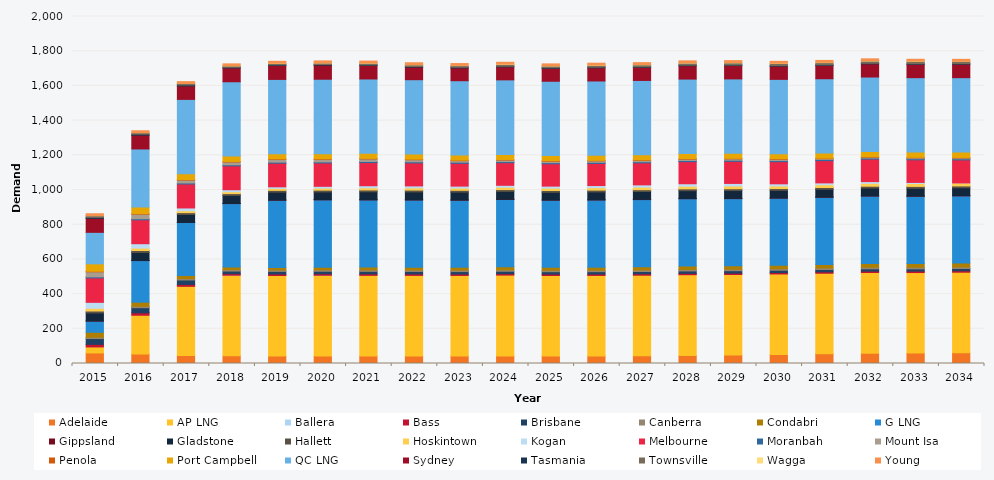
| Category | Adelaide | AP LNG | Ballera | Bass | Brisbane | Canberra | Condabri | G LNG | Gippsland | Gladstone | Hallett | Hoskintown | Kogan | Melbourne | Moranbah | Mount Isa | Penola | Port Campbell | QC LNG | Sydney | Tasmania | Townsville | Wagga | Young |
|---|---|---|---|---|---|---|---|---|---|---|---|---|---|---|---|---|---|---|---|---|---|---|---|---|
| 2015.0 | 60.871 | 34.57 | 0 | 14.805 | 33.591 | 7.631 | 28.355 | 64.65 | 0.695 | 46.165 | 11.235 | 15.606 | 34.311 | 140.697 | 6.137 | 28.959 | 3.208 | 42.857 | 181.643 | 80.61 | 5.536 | 10.002 | 0.051 | 11.006 |
| 2016.0 | 54.677 | 223.457 | 0 | 14.095 | 29.508 | 7.702 | 23.905 | 239.807 | 0.579 | 45.837 | 11.808 | 13.797 | 25.283 | 137.573 | 6.325 | 26.204 | 3.215 | 38.398 | 334.383 | 79.609 | 5.462 | 9.026 | 0.015 | 10.891 |
| 2017.0 | 46.43 | 398.305 | 0 | 10.808 | 25.788 | 7.858 | 18.191 | 305.315 | 0.603 | 45.673 | 10.566 | 10.987 | 15.924 | 137.908 | 6.309 | 16.315 | 3.26 | 33.519 | 428.478 | 77.583 | 5.387 | 8.47 | 0.066 | 10.962 |
| 2018.0 | 44.404 | 464.383 | 0 | 8.757 | 15.307 | 7.981 | 15.763 | 364.984 | 1.026 | 46.041 | 10.619 | 10.879 | 11.39 | 137.563 | 6.294 | 15.779 | 3.301 | 30.865 | 428.478 | 79.634 | 3.835 | 8.343 | 0.375 | 11.029 |
| 2019.0 | 42.955 | 464.383 | 0.001 | 8.525 | 15.025 | 8.061 | 14.913 | 387.217 | 0.991 | 45.396 | 10.464 | 11.159 | 9.322 | 135.987 | 6.279 | 15.681 | 3.292 | 29.294 | 428.478 | 80.36 | 3.823 | 8.104 | 0.96 | 11.021 |
| 2020.0 | 42.849 | 465.655 | 0.001 | 8.391 | 14.686 | 8.11 | 15.385 | 388.278 | 1.146 | 44.237 | 10.455 | 11.561 | 10.446 | 134.358 | 6.427 | 14.7 | 3.278 | 28.899 | 429.652 | 80.929 | 3.85 | 8.845 | 0.935 | 10.957 |
| 2021.0 | 43.668 | 464.383 | 0 | 8.273 | 14.747 | 8.168 | 16.456 | 387.217 | 1.377 | 45.446 | 10.451 | 12.498 | 11.931 | 133.407 | 6.568 | 14.22 | 3.287 | 29.25 | 428.478 | 77.64 | 3.826 | 9.641 | 1.281 | 10.892 |
| 2022.0 | 43.447 | 464.383 | 0 | 8.205 | 14.593 | 8.219 | 16.421 | 387.217 | 1.144 | 45.428 | 10.446 | 12.64 | 11.448 | 132.397 | 6.701 | 11.763 | 3.297 | 29.547 | 428.478 | 72.302 | 3.8 | 9.8 | 0.983 | 10.817 |
| 2023.0 | 43.077 | 464.383 | 0 | 8.134 | 14.277 | 8.29 | 15.885 | 387.217 | 1.178 | 45.407 | 10.398 | 12.825 | 11.309 | 131.178 | 6.686 | 8.553 | 3.278 | 29.329 | 428.478 | 73.652 | 3.779 | 9.618 | 1.073 | 10.809 |
| 2024.0 | 43.856 | 465.655 | 0 | 8.063 | 14.109 | 8.379 | 17.05 | 388.278 | 1.263 | 45.399 | 10.408 | 13.538 | 11.041 | 130.27 | 6.671 | 8.354 | 3.299 | 29.477 | 429.652 | 75.036 | 3.757 | 9.994 | 1.774 | 10.83 |
| 2025.0 | 42.949 | 464.383 | 0 | 7.997 | 13.789 | 8.464 | 16.697 | 387.217 | 1.072 | 44.186 | 10.405 | 13.616 | 11.605 | 128.477 | 6.656 | 8.15 | 3.279 | 29.333 | 428.478 | 74.21 | 3.751 | 10.149 | 1.221 | 10.85 |
| 2026.0 | 43.149 | 464.383 | 0 | 7.954 | 13.888 | 8.545 | 17.389 | 387.217 | 1.042 | 45.391 | 10.365 | 14.066 | 12.271 | 127.276 | 6.642 | 7.958 | 3.275 | 29.048 | 428.478 | 75.991 | 3.608 | 10.519 | 1.552 | 10.872 |
| 2027.0 | 44.351 | 464.383 | 0 | 7.944 | 13.722 | 8.624 | 18.512 | 387.217 | 1.213 | 45.397 | 10.401 | 14.701 | 13.131 | 126.772 | 6.627 | 7.765 | 3.284 | 28.9 | 428.478 | 75.405 | 3.483 | 11.292 | 1.669 | 10.89 |
| 2028.0 | 45.935 | 465.655 | 0 | 7.964 | 13.88 | 8.725 | 19.123 | 388.278 | 1.271 | 45.405 | 10.417 | 15.132 | 14.291 | 127.207 | 6.612 | 7.572 | 3.303 | 28.948 | 429.652 | 76.895 | 3.474 | 11.752 | 1.871 | 10.934 |
| 2029.0 | 48.519 | 464.383 | 0 | 7.984 | 13.901 | 8.824 | 19.454 | 387.217 | 1.476 | 45.078 | 10.493 | 15.535 | 14.989 | 127.439 | 6.598 | 7.375 | 3.339 | 29.232 | 428.478 | 76.856 | 3.456 | 12.247 | 1.966 | 10.966 |
| 2030.0 | 51.596 | 464.383 | 0 | 8.015 | 13.447 | 8.921 | 19.459 | 387.217 | 1.246 | 43.528 | 10.487 | 15.027 | 12.321 | 127.517 | 6.583 | 7.164 | 3.357 | 29.003 | 428.478 | 75.77 | 3.397 | 12.251 | 1.343 | 11 |
| 2031.0 | 55.766 | 464.383 | 0 | 8.063 | 13.563 | 8.989 | 19.988 | 387.217 | 1.27 | 44.708 | 10.507 | 15.843 | 10.681 | 128.125 | 6.569 | 4.37 | 3.352 | 29.384 | 428.478 | 76.643 | 3.379 | 12.952 | 1.638 | 10.995 |
| 2032.0 | 58.668 | 465.655 | 0 | 8.123 | 13.295 | 9.041 | 21.955 | 388.278 | 1.527 | 44.706 | 10.56 | 16.381 | 10.18 | 129.23 | 6.555 | 4.374 | 3.373 | 29.555 | 429.652 | 75.782 | 3.361 | 13.255 | 1.607 | 10.967 |
| 2033.0 | 59.819 | 464.383 | 0 | 8.183 | 13.152 | 9.092 | 21.877 | 387.217 | 1.548 | 44.683 | 10.656 | 16.879 | 6.14 | 130.448 | 6.54 | 4.364 | 3.407 | 30.614 | 428.478 | 76.862 | 3.342 | 13.701 | 1.183 | 10.944 |
| 2034.0 | 61.761 | 464.383 | 0 | 8.236 | 13.019 | 9.143 | 22.094 | 387.217 | 2.252 | 44.657 | 10.816 | 16.925 | 0.199 | 132.62 | 6.54 | 4.349 | 3.479 | 31.318 | 428.478 | 77.435 | 3.321 | 13.81 | 0.141 | 10.92 |